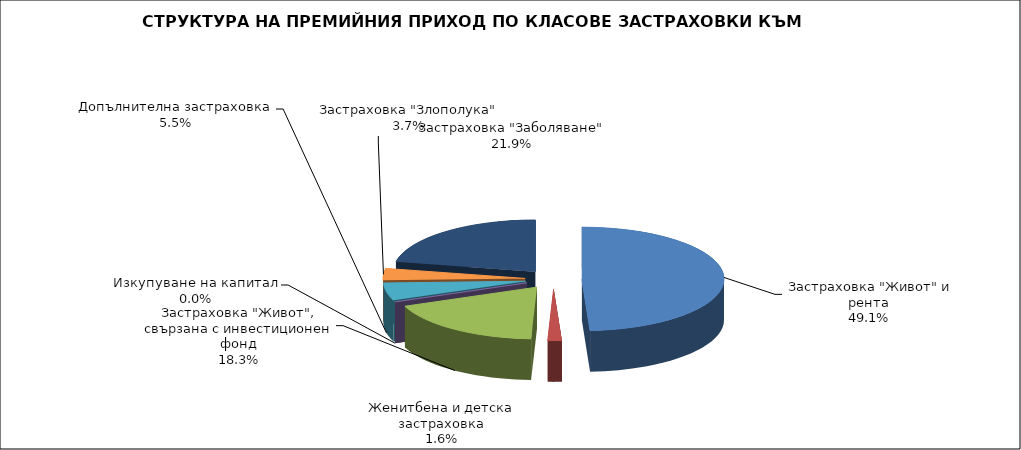
| Category |  Застраховка "Живот" и рента |
|---|---|
|  Застраховка "Живот" и рента | 244784237.26 |
| Женитбена и детска застраховка | 7884284.194 |
| Застраховка "Живот", свързана с инвестиционен фонд | 91324724.557 |
| Изкупуване на капитал | 0 |
| Допълнителна застраховка | 27233881.231 |
| Застраховка "Злополука" | 18273460.323 |
| Застраховка "Заболяване" | 109232699.236 |